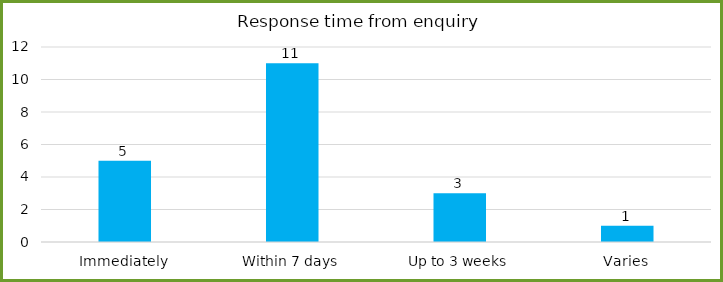
| Category | Series 0 |
|---|---|
| Immediately | 5 |
| Within 7 days | 11 |
| Up to 3 weeks | 3 |
| Varies | 1 |